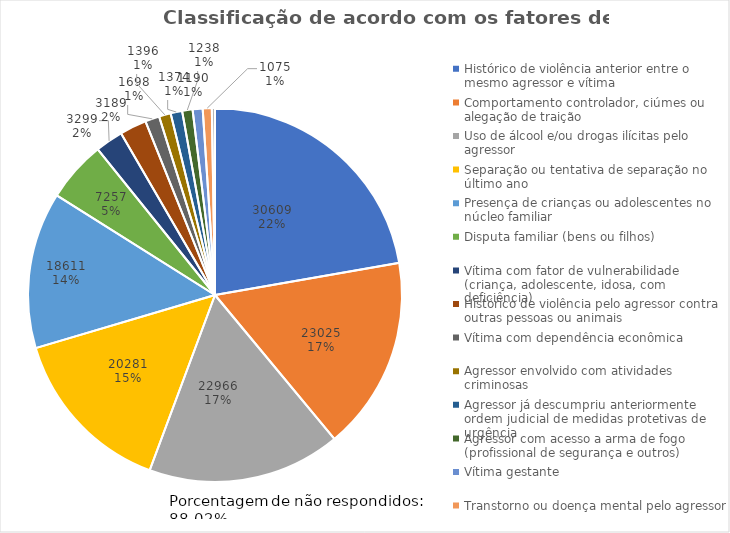
| Category | Series 0 |
|---|---|
| Histórico de violência anterior entre o mesmo agressor e vítima | 30609 |
| Comportamento controlador, ciúmes ou alegação de traição | 23025 |
| Uso de álcool e/ou drogas ilícitas pelo agressor | 22966 |
| Separação ou tentativa de separação no último ano | 20281 |
| Presença de crianças ou adolescentes no núcleo familiar | 18611 |
| Disputa familiar (bens ou filhos) | 7257 |
| Vítima com fator de vulnerabilidade (criança, adolescente, idosa, com deficiência) | 3299 |
| Histórico de violência pelo agressor contra outras pessoas ou animais | 3189 |
| Vítima com dependência econômica | 1698 |
| Agressor envolvido com atividades criminosas | 1396 |
| Agressor já descumpriu anteriormente ordem judicial de medidas protetivas de urgência | 1374 |
| Agressor com acesso a arma de fogo (profissional de segurança e outros) | 1238 |
| Vítima gestante | 1190 |
| Transtorno ou doença mental pelo agressor | 1075 |
| Vítima sem parentes próximos ou rede de apoio | 373 |